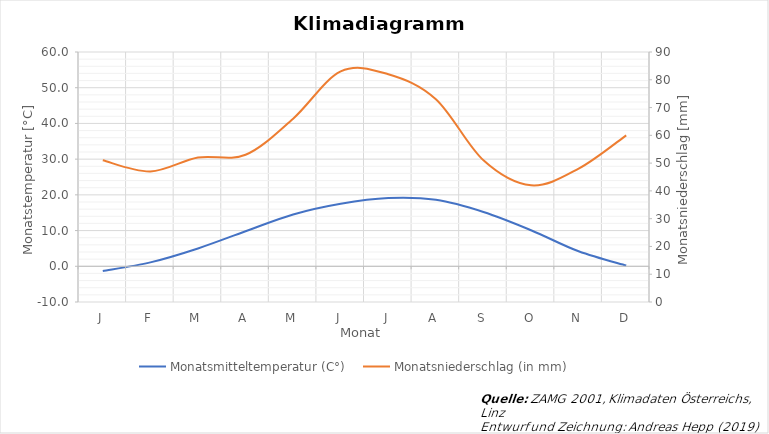
| Category | Monatsmitteltemperatur (C°) |
|---|---|
| J | -1.3 |
| F | 1.1 |
| M | 5 |
| A | 9.8 |
| M | 14.5 |
| J | 17.5 |
| J | 19.1 |
| A | 18.6 |
| S | 15.2 |
| O | 10.1 |
| N | 4.2 |
| D | 0.2 |